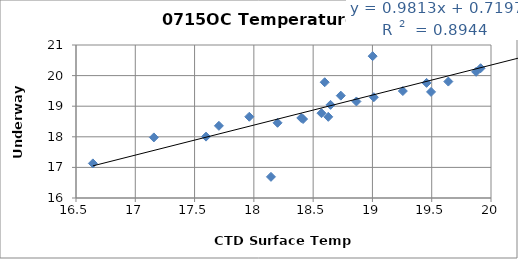
| Category | Series 0 |
|---|---|
| 20.7885 | 20.972 |
| 20.44645 | 21.053 |
| 20.5176 | 20.855 |
| 20.69445 | 20.958 |
| 20.4728 | 20.587 |
| 18.57055 | 18.772 |
| 19.49455 | 19.467 |
| 18.40005 | 18.616 |
| 19.45675 | 19.762 |
| 19.011699999999998 | 19.294 |
| 18.73335 | 19.345 |
| 21.19275 | 21.173 |
| 20.5253 | 21.097 |
| 20.859099999999998 | 21.066 |
| 21.13395 | 21.052 |
| 22.0043 | 22.369 |
| 21.16835 | 22.548 |
| 21.1269 | 21.537 |
| 21.96035 | 22.389 |
| 21.3196 | 21.574 |
| 20.2684 | 20.468 |
| 18.64675 | 19.044 |
| 22.0116 | 21.481 |
| 21.626199999999997 | 22.69 |
| 19.87445 | 20.124 |
| 20.19715 | 20.695 |
| 20.1281 | 20.686 |
| 20.38305 | 20.668 |
| 19.0019 | 20.635 |
| 17.7053 | 18.358 |
| 19.2564 | 19.495 |
| 18.41505 | 18.58 |
| 18.8649 | 19.155 |
| 18.5975 | 19.783 |
| 17.5967 | 18.006 |
| 18.1998 | 18.457 |
| 17.1566 | 17.98 |
| 16.64225 | 17.131 |
| 18.144199999999998 | 16.691 |
| 18.62745 | 18.653 |
| 19.6401 | 19.805 |
| 17.96145 | 18.655 |
| 20.06835 | 20.358 |
| 20.4309 | 20.709 |
| 20.6081 | 20.995 |
| 20.99555 | 21.224 |
| 19.91255 | 20.241 |